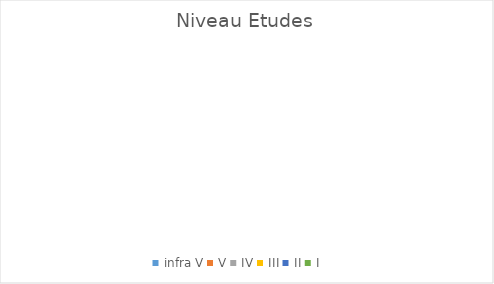
| Category | Series 0 |
|---|---|
| infra V | 0 |
| V | 0 |
| IV | 0 |
| III | 0 |
| II | 0 |
| I | 0 |